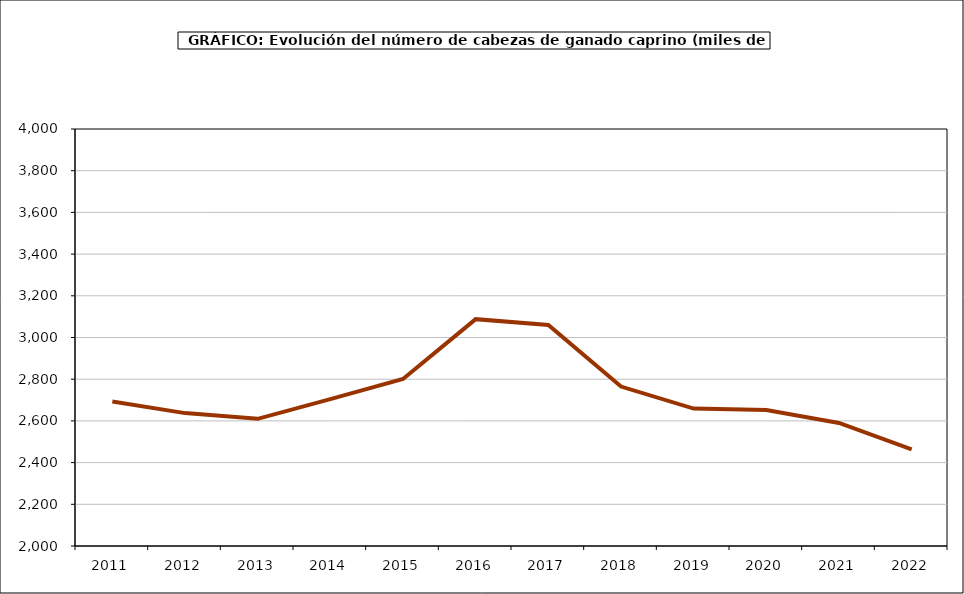
| Category | Total Ovino |
|---|---|
| 2011.0 | 2693 |
| 2012.0 | 2637.336 |
| 2013.0 | 2609.989 |
| 2014.0 | 2704.229 |
| 2015.0 | 2801.064 |
| 2016.0 | 3088.035 |
| 2017.0 | 3059.731 |
| 2018.0 | 2764.79 |
| 2019.0 | 2659 |
| 2020.0 | 2652 |
| 2021.0 | 2590 |
| 2022.0 | 2464 |